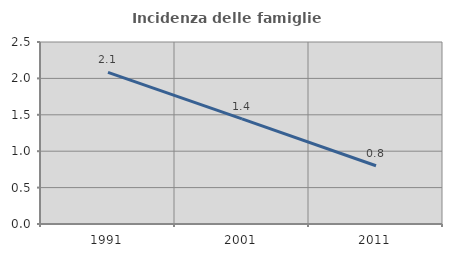
| Category | Incidenza delle famiglie numerose |
|---|---|
| 1991.0 | 2.083 |
| 2001.0 | 1.443 |
| 2011.0 | 0.8 |